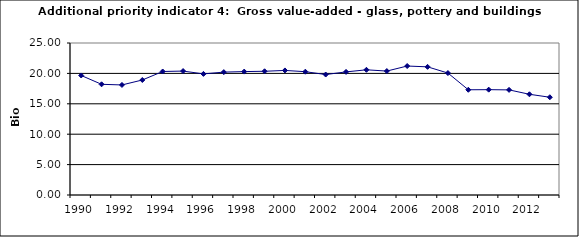
| Category | Gross value-added - glass, pottery and buildings materials industry, Bio Euro (EC95) |
|---|---|
| 1990 | 19.658 |
| 1991 | 18.206 |
| 1992 | 18.102 |
| 1993 | 18.915 |
| 1994 | 20.315 |
| 1995 | 20.384 |
| 1996 | 19.917 |
| 1997 | 20.211 |
| 1998 | 20.298 |
| 1999 | 20.35 |
| 2000 | 20.488 |
| 2001 | 20.28 |
| 2002 | 19.814 |
| 2003 | 20.246 |
| 2004 | 20.592 |
| 2005 | 20.384 |
| 2006 | 21.214 |
| 2007 | 21.076 |
| 2008 | 20.056 |
| 2009 | 17.307 |
| 2010 | 17.324 |
| 2011 | 17.289 |
| 2012 | 16.563 |
| 2013 | 16.079 |